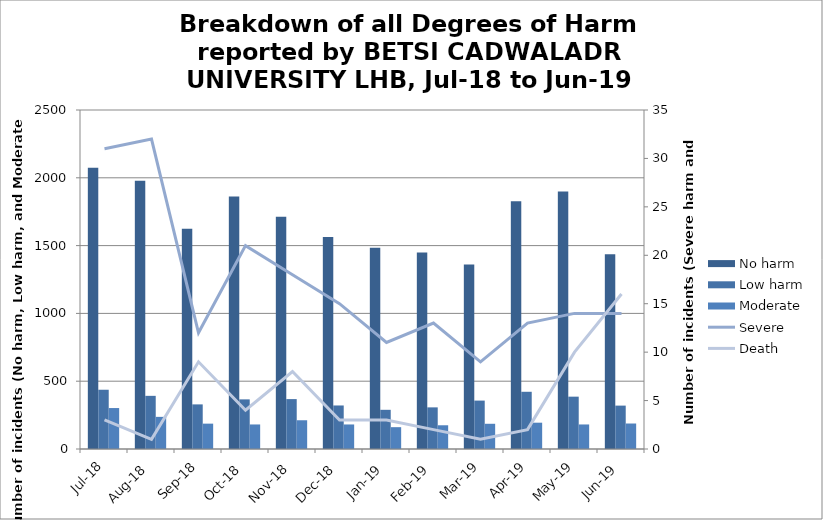
| Category | No harm | Low harm | Moderate |
|---|---|---|---|
| Jul-18 | 2074 | 437 | 302 |
| Aug-18 | 1978 | 392 | 237 |
| Sep-18 | 1624 | 329 | 187 |
| Oct-18 | 1862 | 366 | 181 |
| Nov-18 | 1713 | 368 | 212 |
| Dec-18 | 1564 | 321 | 181 |
| Jan-19 | 1484 | 289 | 161 |
| Feb-19 | 1450 | 307 | 175 |
| Mar-19 | 1361 | 357 | 186 |
| Apr-19 | 1827 | 422 | 194 |
| May-19 | 1899 | 386 | 181 |
| Jun-19 | 1437 | 320 | 188 |